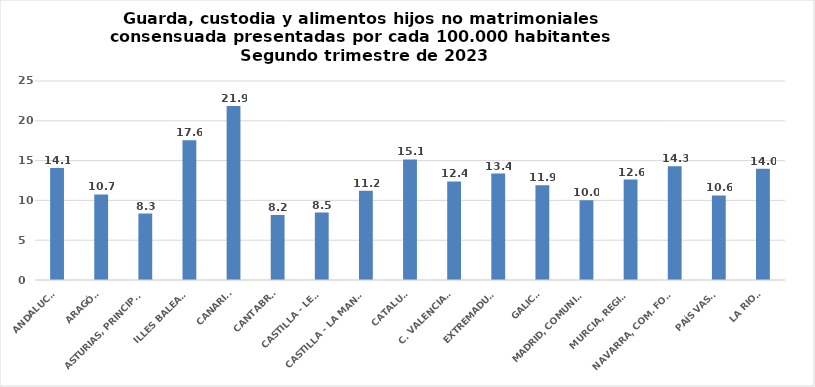
| Category | Series 0 |
|---|---|
| ANDALUCÍA | 14.076 |
| ARAGÓN | 10.746 |
| ASTURIAS, PRINCIPADO | 8.345 |
| ILLES BALEARS | 17.568 |
| CANARIAS | 21.872 |
| CANTABRIA | 8.156 |
| CASTILLA - LEÓN | 8.478 |
| CASTILLA - LA MANCHA | 11.199 |
| CATALUÑA | 15.141 |
| C. VALENCIANA | 12.38 |
| EXTREMADURA | 13.374 |
| GALICIA | 11.89 |
| MADRID, COMUNIDAD | 10.016 |
| MURCIA, REGIÓN | 12.623 |
| NAVARRA, COM. FORAL | 14.281 |
| PAÍS VASCO | 10.631 |
| LA RIOJA | 13.964 |